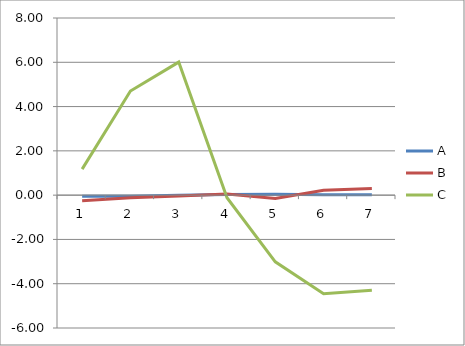
| Category | A | B | C |
|---|---|---|---|
| 0 | -0.054 | -0.252 | 1.175 |
| 1 | -0.05 | -0.12 | 4.702 |
| 2 | -0.01 | -0.044 | 6.009 |
| 3 | 0.034 | 0.047 | -0.117 |
| 4 | 0.039 | -0.153 | -3.011 |
| 5 | 0.018 | 0.222 | -4.457 |
| 6 | 0.023 | 0.3 | -4.3 |